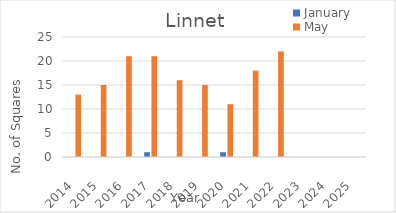
| Category | January | May |
|---|---|---|
| 2014.0 | 0 | 13 |
| 2015.0 | 0 | 15 |
| 2016.0 | 0 | 21 |
| 2017.0 | 1 | 21 |
| 2018.0 | 0 | 16 |
| 2019.0 | 0 | 15 |
| 2020.0 | 1 | 11 |
| 2021.0 | 0 | 18 |
| 2022.0 | 0 | 22 |
| 2023.0 | 0 | 0 |
| 2024.0 | 0 | 0 |
| 2025.0 | 0 | 0 |